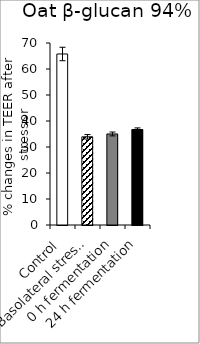
| Category | average |
|---|---|
| Control | 65.773 |
| Basolateral stressor | 33.913 |
| 0 h fermentation | 35.016 |
| 24 h fermentation | 36.732 |